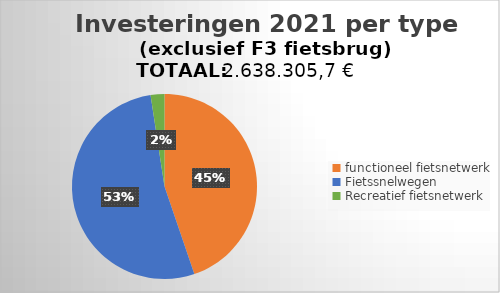
| Category | Series 0 |
|---|---|
| functioneel fietsnetwerk | 0.448 |
| Fietssnelwegen | 0.528 |
| Recreatief fietsnetwerk | 0.024 |